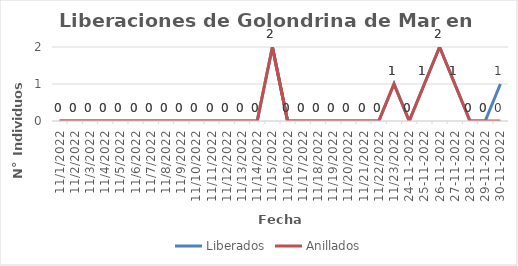
| Category | Liberados | Anillados |
|---|---|---|
| 11/1/22 | 0 | 0 |
| 11/2/22 | 0 | 0 |
| 11/3/22 | 0 | 0 |
| 11/4/22 | 0 | 0 |
| 11/5/22 | 0 | 0 |
| 11/6/22 | 0 | 0 |
| 11/7/22 | 0 | 0 |
| 11/8/22 | 0 | 0 |
| 11/9/22 | 0 | 0 |
| 11/10/22 | 0 | 0 |
| 11/11/22 | 0 | 0 |
| 11/12/22 | 0 | 0 |
| 11/13/22 | 0 | 0 |
| 11/14/22 | 0 | 0 |
| 11/15/22 | 2 | 2 |
| 11/16/22 | 0 | 0 |
| 11/17/22 | 0 | 0 |
| 11/18/22 | 0 | 0 |
| 11/19/22 | 0 | 0 |
| 11/20/22 | 0 | 0 |
| 11/21/22 | 0 | 0 |
| 11/22/22 | 0 | 0 |
| 11/23/22 | 1 | 1 |
| 11/24/22 | 0 | 0 |
| 11/25/22 | 1 | 1 |
| 11/26/22 | 2 | 2 |
| 11/27/22 | 1 | 1 |
| 11/28/22 | 0 | 0 |
| 11/29/22 | 0 | 0 |
| 11/30/22 | 1 | 0 |